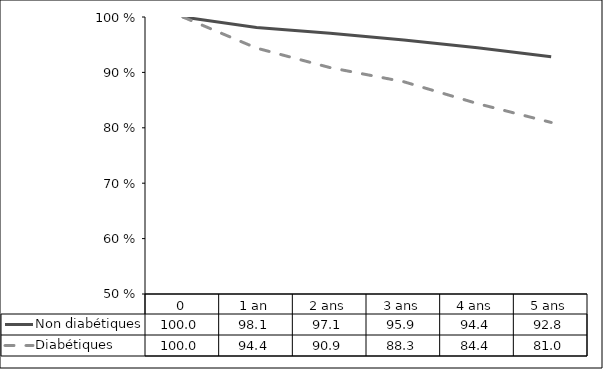
| Category | Non diabétiques | Diabétiques |
|---|---|---|
| 0 | 100 | 100 |
| 1 an | 98.123 | 94.389 |
| 2 ans | 97.051 | 90.859 |
| 3 ans | 95.856 | 88.311 |
| 4 ans | 94.431 | 84.367 |
| 5 ans | 92.814 | 80.967 |